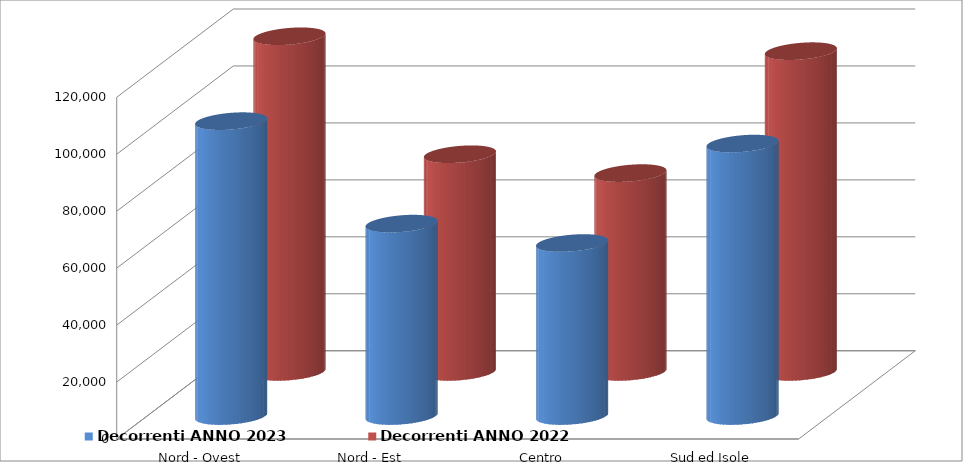
| Category | Decorrenti ANNO 2023 | Decorrenti ANNO 2022 |
|---|---|---|
| Nord - Ovest | 103551 | 117862 |
| Nord - Est | 67569 | 76443 |
| Centro | 60758 | 69819 |
| Sud ed Isole | 95680 | 112629 |